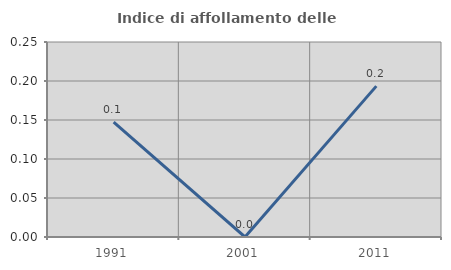
| Category | Indice di affollamento delle abitazioni  |
|---|---|
| 1991.0 | 0.147 |
| 2001.0 | 0 |
| 2011.0 | 0.193 |